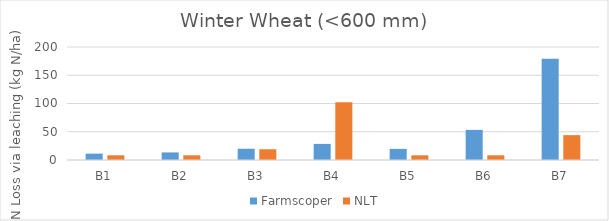
| Category | Farmscoper | NLT |
|---|---|---|
| B1 | 11.28 | 8.33 |
| B2 | 13.431 | 8.33 |
| B3 | 19.874 | 19.03 |
| B4 | 28.465 | 102.3 |
| B5 | 19.683 | 8.33 |
| B6 | 53.283 | 8.33 |
| B7 | 179.283 | 44.01 |